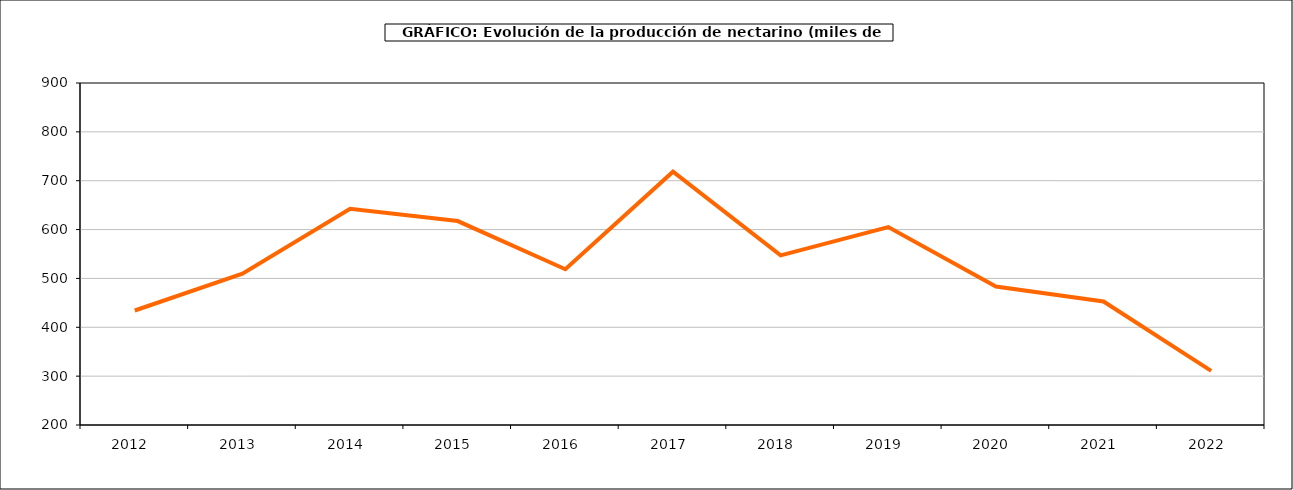
| Category | producción melocotonero |
|---|---|
| 2012.0 | 434.327 |
| 2013.0 | 509.713 |
| 2014.0 | 642.573 |
| 2015.0 | 617.396 |
| 2016.0 | 518.794 |
| 2017.0 | 718.528 |
| 2018.0 | 547.119 |
| 2019.0 | 605.108 |
| 2020.0 | 483.555 |
| 2021.0 | 452.73 |
| 2022.0 | 310.711 |